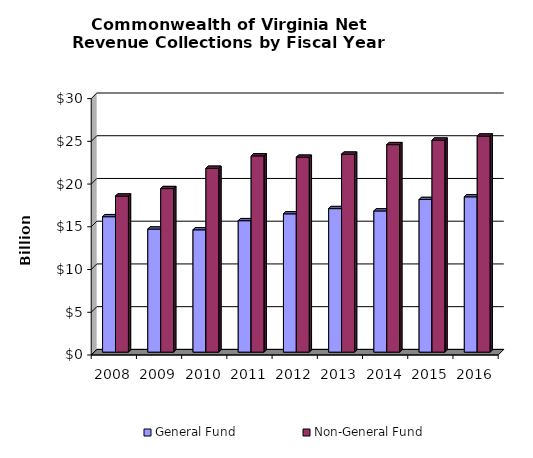
| Category | General Fund | Non-General Fund  |
|---|---|---|
| 2008.0 | 15.845 | 18.257 |
| 2009.0 | 14.398 | 19.134 |
| 2010.0 | 14.31 | 21.508 |
| 2011.0 | 15.379 | 22.96 |
| 2012.0 | 16.182 | 22.803 |
| 2013.0 | 16.792 | 23.162 |
| 2014.0 | 16.52 | 24.275 |
| 2015.0 | 17.857 | 24.805 |
| 2016.0 | 18.17 | 25.28 |